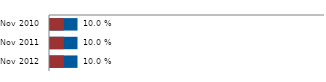
| Category | Global acute malnutrition | Severe acute malnutrition |
|---|---|---|
| 2010-11-01 | 0.1 | 0.05 |
| 2011-11-01 | 0.1 | 0.05 |
| 2012-11-01 | 0.1 | 0.05 |